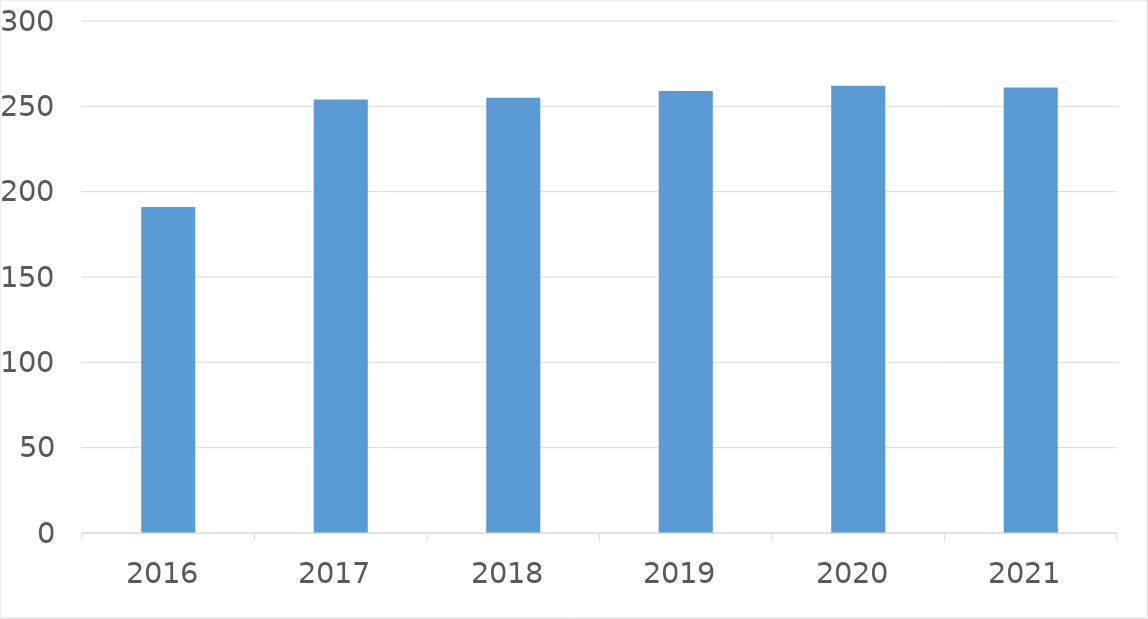
| Category | Series 0 |
|---|---|
| 2016 | 191 |
| 2017 | 254 |
| 2018 | 255 |
| 2019 | 259 |
| 2020 | 262 |
| 2021 | 261 |